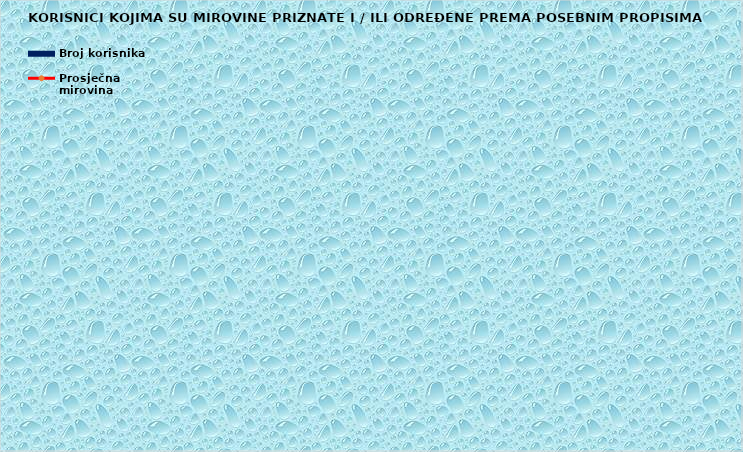
| Category | Broj korisnika |
|---|---|
|      a) radnici na poslovima ovlaštenih službenih osoba u tijelima unutarnjih 
poslova i pravosuđa, kojima je pravo na mirovinu priznato prema propisima
koji su bili na snazi do stupanja na snagu Zakona o pravima iz mirovinskog
osiguranja DVO, PS i OSO | 8145 |
|      b) radnici na  poslovima policijskih službenika, ovlaštenih službenih osoba pravosuđa i službene osobe s posebnim dužnostima i ovlastima u sigurnosno obavještajnom sustavu RH koji su pravo na mirovinu ostvarili prema Zakonu o pravima DVO, PS i OSO | 8805 |
|      c) radnici na poslovima razminiranja | 595 |
| Korisnici koji pravo na mirovinu ostvaruju prema Zakonu o vatrogastvu (NN 125/19)* | 91 |
| Djelatne vojne osobe - DVO  | 15837 |
| Pripadnici Hrvatske domovinske vojske od 1941. do 1945. godine | 3192 |
| Bivši politički zatvorenici | 2567 |
| Hrvatski branitelji iz Domovinskog rata - ZOHBDR | 70907 |
| Mirovine priznate prema općim propisima, a određene prema
ZOHBDR - u iz 2017. (čl. 27., 35., 48. i 49. stavak 2.)  | 47172 |
| Pripadnici bivše Jugoslavenske narodne armije - JNA | 4792 |
| Pripadnici bivše Jugoslavenske narodne armije - JNA - čl. 185 ZOMO | 159 |
| Sudionici Narodnooslobodilačkog rata - NOR | 7831 |
| Zastupnici u Hrvatskom saboru, članovi Vlade, suci Ustavnog suda i glavni državni revizor  | 679 |
| Članovi Izvršnog vijeća Sabora, Saveznog izvršnog vijeća i administrativno umirovljeni javni službenici | 82 |
| Bivši službenici u saveznim tijelima bivše SFRJ - članak 38. ZOMO | 30 |
| Redoviti članovi Hrvatske akademije znanosti i umjetnosti - HAZU | 133 |
| Radnici u Istarskim ugljenokopima "Tupljak" d.d. Labin  | 250 |
| Radnici profesionalno izloženi azbestu | 859 |
| Osiguranici - članovi posade broda u međunarodnoj plovidbi i nacionalnoj plovidbi - članak 129. a stavak 2. Pomorskog zakonika | 193 |
| Pripadnici Hrvatskog vijeća obrane  - HVO  | 6776 |